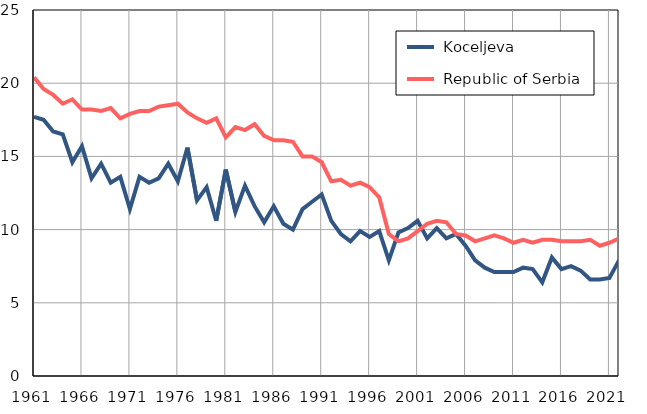
| Category |  Koceljeva |  Republic of Serbia |
|---|---|---|
| 1961.0 | 17.7 | 20.4 |
| 1962.0 | 17.5 | 19.6 |
| 1963.0 | 16.7 | 19.2 |
| 1964.0 | 16.5 | 18.6 |
| 1965.0 | 14.6 | 18.9 |
| 1966.0 | 15.7 | 18.2 |
| 1967.0 | 13.5 | 18.2 |
| 1968.0 | 14.5 | 18.1 |
| 1969.0 | 13.2 | 18.3 |
| 1970.0 | 13.6 | 17.6 |
| 1971.0 | 11.4 | 17.9 |
| 1972.0 | 13.6 | 18.1 |
| 1973.0 | 13.2 | 18.1 |
| 1974.0 | 13.5 | 18.4 |
| 1975.0 | 14.5 | 18.5 |
| 1976.0 | 13.3 | 18.6 |
| 1977.0 | 15.6 | 18 |
| 1978.0 | 12 | 17.6 |
| 1979.0 | 12.9 | 17.3 |
| 1980.0 | 10.6 | 17.6 |
| 1981.0 | 14.1 | 16.3 |
| 1982.0 | 11.2 | 17 |
| 1983.0 | 13 | 16.8 |
| 1984.0 | 11.6 | 17.2 |
| 1985.0 | 10.5 | 16.4 |
| 1986.0 | 11.6 | 16.1 |
| 1987.0 | 10.4 | 16.1 |
| 1988.0 | 10 | 16 |
| 1989.0 | 11.4 | 15 |
| 1990.0 | 11.9 | 15 |
| 1991.0 | 12.4 | 14.6 |
| 1992.0 | 10.6 | 13.3 |
| 1993.0 | 9.7 | 13.4 |
| 1994.0 | 9.2 | 13 |
| 1995.0 | 9.9 | 13.2 |
| 1996.0 | 9.5 | 12.9 |
| 1997.0 | 9.9 | 12.2 |
| 1998.0 | 7.9 | 9.7 |
| 1999.0 | 9.8 | 9.2 |
| 2000.0 | 10.1 | 9.4 |
| 2001.0 | 10.6 | 9.9 |
| 2002.0 | 9.4 | 10.4 |
| 2003.0 | 10.1 | 10.6 |
| 2004.0 | 9.4 | 10.5 |
| 2005.0 | 9.7 | 9.7 |
| 2006.0 | 8.9 | 9.6 |
| 2007.0 | 7.9 | 9.2 |
| 2008.0 | 7.4 | 9.4 |
| 2009.0 | 7.1 | 9.6 |
| 2010.0 | 7.1 | 9.4 |
| 2011.0 | 7.1 | 9.1 |
| 2012.0 | 7.4 | 9.3 |
| 2013.0 | 7.3 | 9.1 |
| 2014.0 | 6.4 | 9.3 |
| 2015.0 | 8.1 | 9.3 |
| 2016.0 | 7.3 | 9.2 |
| 2017.0 | 7.5 | 9.2 |
| 2018.0 | 7.2 | 9.2 |
| 2019.0 | 6.6 | 9.3 |
| 2020.0 | 6.6 | 8.9 |
| 2021.0 | 6.7 | 9.1 |
| 2022.0 | 7.9 | 9.4 |